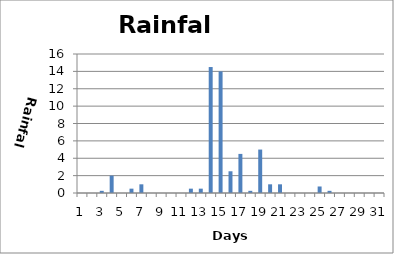
| Category | Rain |
|---|---|
| 0 | 0 |
| 1 | 0 |
| 2 | 0.25 |
| 3 | 2 |
| 4 | 0 |
| 5 | 0.5 |
| 6 | 1 |
| 7 | 0 |
| 8 | 0 |
| 9 | 0 |
| 10 | 0 |
| 11 | 0.5 |
| 12 | 0.5 |
| 13 | 14.5 |
| 14 | 14 |
| 15 | 2.5 |
| 16 | 4.5 |
| 17 | 0.25 |
| 18 | 5 |
| 19 | 1 |
| 20 | 1 |
| 21 | 0 |
| 22 | 0 |
| 23 | 0 |
| 24 | 0.75 |
| 25 | 0.25 |
| 26 | 0 |
| 27 | 0 |
| 28 | 0 |
| 29 | 0 |
| 30 | 0 |